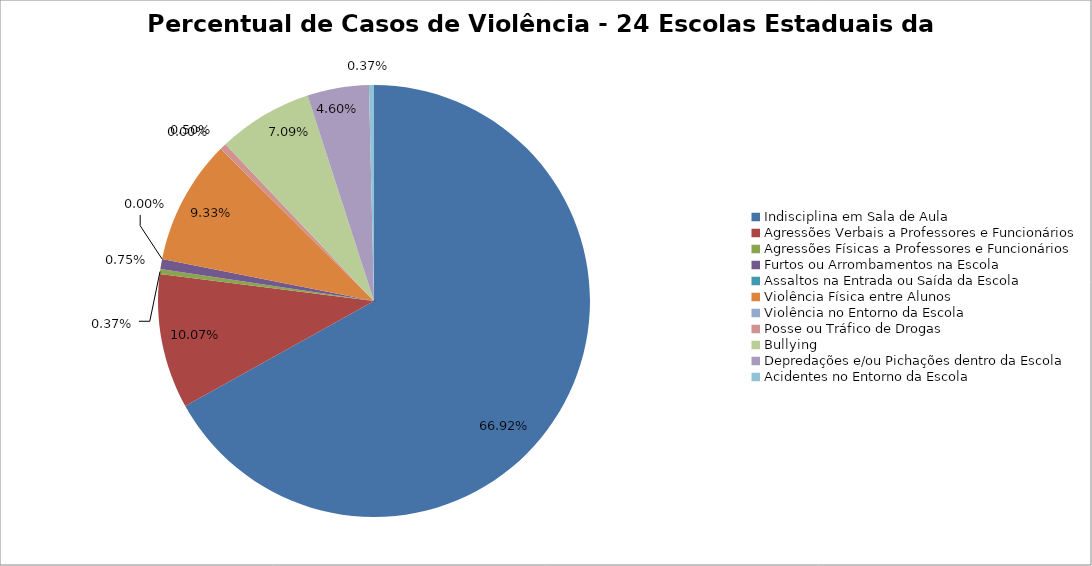
| Category | Percentual |
|---|---|
| Indisciplina em Sala de Aula | 0.669 |
| Agressões Verbais a Professores e Funcionários | 0.101 |
| Agressões Físicas a Professores e Funcionários | 0.004 |
| Furtos ou Arrombamentos na Escola | 0.007 |
| Assaltos na Entrada ou Saída da Escola | 0 |
| Violência Física entre Alunos | 0.093 |
| Violência no Entorno da Escola | 0 |
| Posse ou Tráfico de Drogas | 0.005 |
| Bullying | 0.071 |
| Depredações e/ou Pichações dentro da Escola | 0.046 |
| Acidentes no Entorno da Escola | 0.004 |